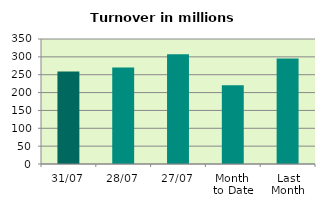
| Category | Series 0 |
|---|---|
| 31/07 | 259.218 |
| 28/07 | 270.532 |
| 27/07 | 307.168 |
| Month 
to Date | 220.762 |
| Last
Month | 295.453 |